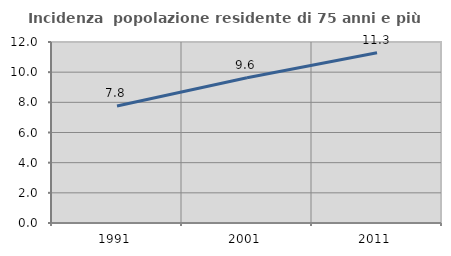
| Category | Incidenza  popolazione residente di 75 anni e più |
|---|---|
| 1991.0 | 7.755 |
| 2001.0 | 9.628 |
| 2011.0 | 11.288 |